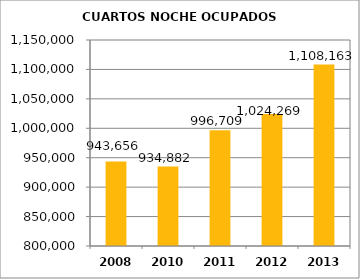
| Category | CUARTOS NOCHE OCUPADOS MENSUAL |
|---|---|
| 2008.0 | 943656 |
| 2010.0 | 934882 |
| 2011.0 | 996709 |
| 2012.0 | 1024269 |
| 2013.0 | 1108163 |